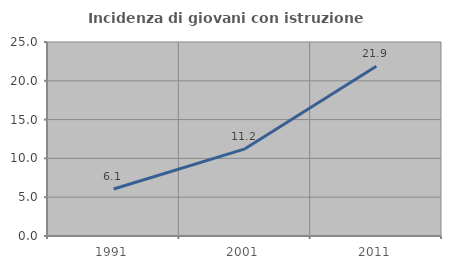
| Category | Incidenza di giovani con istruzione universitaria |
|---|---|
| 1991.0 | 6.053 |
| 2001.0 | 11.232 |
| 2011.0 | 21.875 |